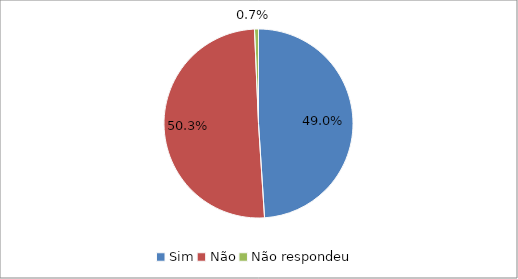
| Category | Series 0 |
|---|---|
| Sim | 0.49 |
| Não | 0.503 |
| Não respondeu | 0.007 |